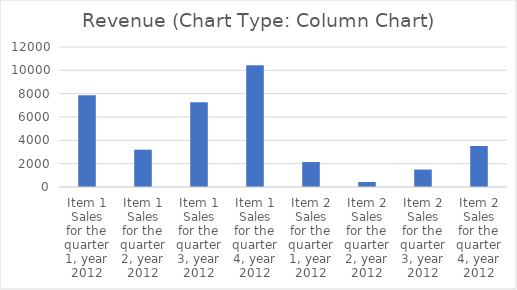
| Category | Revenue |
|---|---|
| Item 1 Sales for the quarter 1, year 2012 | 7861 |
| Item 1 Sales for the quarter 2, year 2012 | 3198 |
| Item 1 Sales for the quarter 3, year 2012 | 7256 |
| Item 1 Sales for the quarter 4, year 2012 | 10434 |
| Item 2 Sales for the quarter 1, year 2012 | 2140 |
| Item 2 Sales for the quarter 2, year 2012 | 430 |
| Item 2 Sales for the quarter 3, year 2012 | 1494 |
| Item 2 Sales for the quarter 4, year 2012 | 3515 |